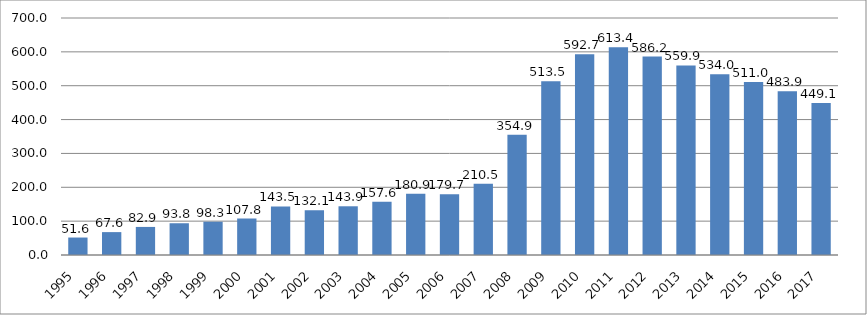
| Category | Disbursed Outstanding Debt |
|---|---|
| 1995.0 | 51.6 |
| 1996.0 | 67.6 |
| 1997.0 | 82.9 |
| 1998.0 | 93.8 |
| 1999.0 | 98.3 |
| 2000.0 | 107.8 |
| 2001.0 | 143.5 |
| 2002.0 | 132.1 |
| 2003.0 | 143.9 |
| 2004.0 | 157.6 |
| 2005.0 | 180.9 |
| 2006.0 | 179.7 |
| 2007.0 | 210.5 |
| 2008.0 | 354.9 |
| 2009.0 | 513.5 |
| 2010.0 | 592.7 |
| 2011.0 | 613.4 |
| 2012.0 | 586.2 |
| 2013.0 | 559.9 |
| 2014.0 | 534 |
| 2015.0 | 511 |
| 2016.0 | 483.9 |
| 2017.0 | 449.1 |